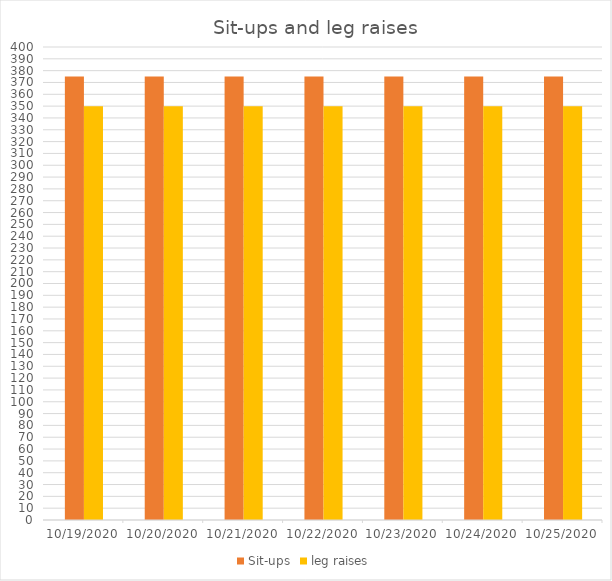
| Category | Sit-ups | leg raises |
|---|---|---|
| 10/19/20 | 375 | 350 |
| 10/20/20 | 375 | 350 |
| 10/21/20 | 375 | 350 |
| 10/22/20 | 375 | 350 |
| 10/23/20 | 375 | 350 |
| 10/24/20 | 375 | 350 |
| 10/25/20 | 375 | 350 |